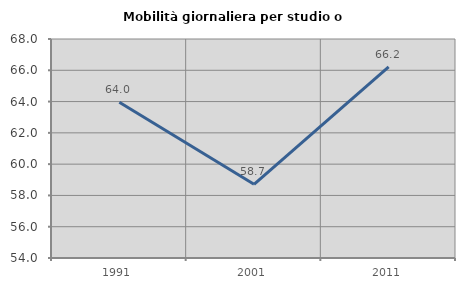
| Category | Mobilità giornaliera per studio o lavoro |
|---|---|
| 1991.0 | 63.953 |
| 2001.0 | 58.71 |
| 2011.0 | 66.223 |